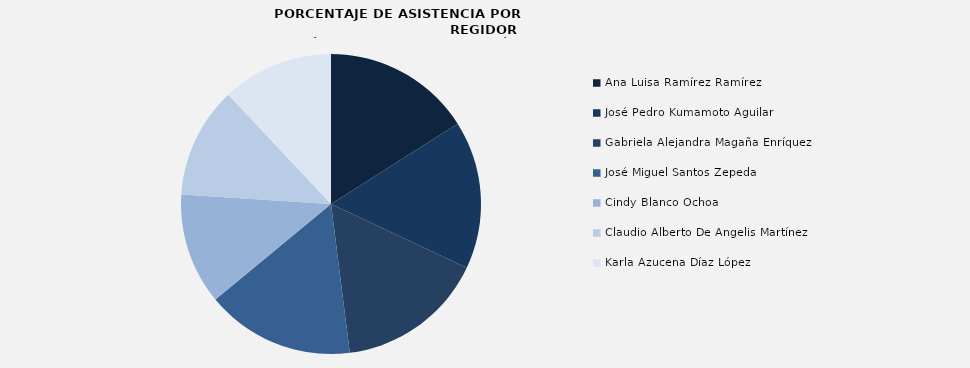
| Category | Ana Luisa Ramírez Ramírez |
|---|---|
| Ana Luisa Ramírez Ramírez | 100 |
| José Pedro Kumamoto Aguilar | 100 |
| Gabriela Alejandra Magaña Enríquez | 100 |
| José Miguel Santos Zepeda | 100 |
| Cindy Blanco Ochoa | 75 |
| Claudio Alberto De Angelis Martínez | 75 |
| Karla Azucena Díaz López | 75 |